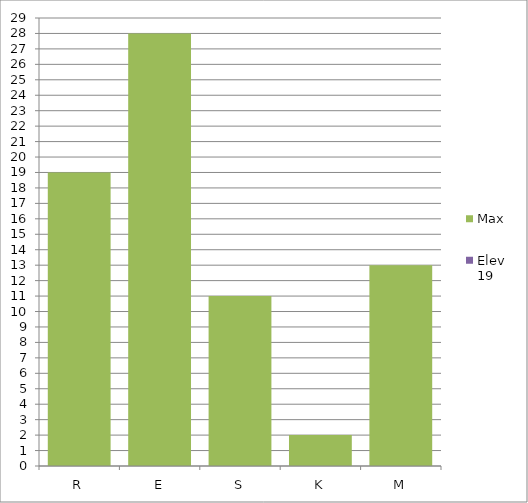
| Category | Max | Elev 19 |
|---|---|---|
| R | 19 | 0 |
| E | 28 | 0 |
| S | 11 | 0 |
| K | 2 | 0 |
| M | 13 | 0 |